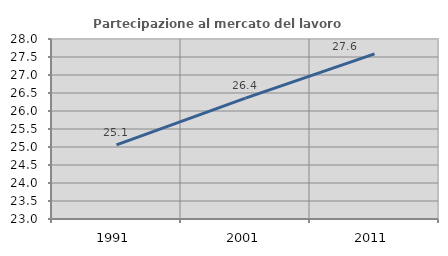
| Category | Partecipazione al mercato del lavoro  femminile |
|---|---|
| 1991.0 | 25.058 |
| 2001.0 | 26.358 |
| 2011.0 | 27.586 |